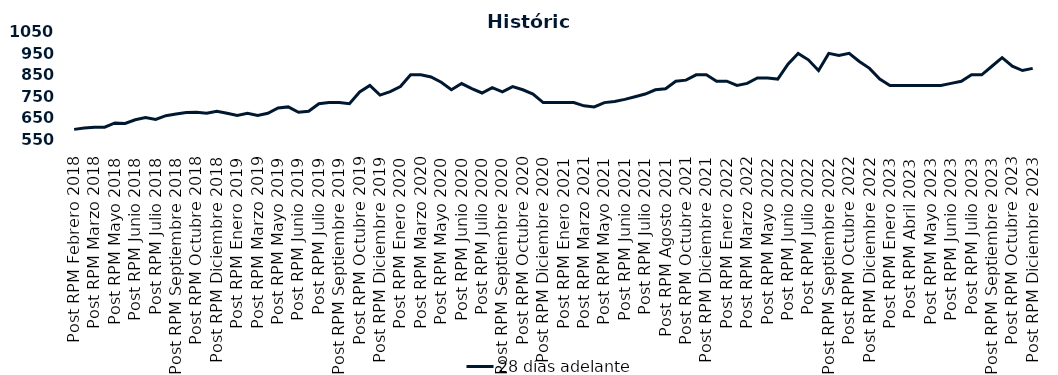
| Category | 28 días adelante |
|---|---|
| Post RPM Febrero 2018 | 595 |
| Pre RPM Marzo 2018 | 601 |
| Post RPM Marzo 2018 | 605 |
| Pre RPM Mayo 2018 | 605 |
| Post RPM Mayo 2018 | 625 |
| Pre RPM Junio 2018 | 623 |
| Post RPM Junio 2018 | 640 |
| Pre RPM Julio 2018 | 650 |
| Post RPM Julio 2018 | 641 |
| Pre RPM Septiembre 2018 | 659 |
| Post RPM Septiembre 2018 | 666.75 |
| Pre RPM Octubre 2018 | 674 |
| Post RPM Octubre 2018 | 675 |
| Pre RPM Diciembre 2018 | 670 |
| Post RPM Diciembre 2018 | 680 |
| Pre RPM Enero 2019 | 670 |
| Post RPM Enero 2019 | 660 |
| Pre RPM Marzo 2019 | 670 |
| Post RPM Marzo 2019 | 660 |
| Pre RPM Mayo 2019 | 670 |
| Post RPM Mayo 2019 | 695 |
| Pre RPM Junio 2019 | 700 |
| Post RPM Junio 2019 | 675 |
| Pre RPM Julio 2019 | 680 |
| Post RPM Julio 2019 | 715 |
| Pre RPM Septiembre 2019 | 720 |
| Post RPM Septiembre 2019 | 720 |
| Pre RPM Octubre 2019 | 715 |
| Post RPM Octubre 2019 | 770 |
| Pre RPM Diciembre 2019 | 800 |
| Post RPM Diciembre 2019 | 755 |
| Pre RPM Enero 2020 | 771 |
| Post RPM Enero 2020 | 795 |
| Pre RPM Marzo 2020 | 850 |
| Post RPM Marzo 2020 | 850 |
| Pre RPM Mayo 2020 | 840 |
| Post RPM Mayo 2020 | 815 |
| Pre RPM Junio 2020 | 780 |
| Post RPM Junio 2020 | 809 |
| Pre RPM Julio 2020 | 785.72 |
| Post RPM Julio 2020 | 765 |
| Pre RPM Septiembre 2020 | 790 |
| Post RPM Septiembre 2020 | 770 |
| Pre RPM Octubre 2020 | 795 |
| Post RPM Octubre 2020 | 780 |
| Pre RPM Diciembre 2020 | 760 |
| Post RPM Diciembre 2020 | 720 |
| Pre RPM Enero 2021 | 720 |
| Post RPM Enero 2021 | 720 |
| Pre RPM Marzo 2021 | 720 |
| Post RPM Marzo 2021 | 705 |
| Pre RPM Mayo 2021 | 700 |
| Post RPM Mayo 2021 | 720 |
| Pre RPM Junio 2021 | 725 |
| Post RPM Junio 2021 | 735 |
| Pre RPM Julio 2021 | 747.5 |
| Post RPM Julio 2021 | 760 |
| Pre RPM Agosto 2021 | 780 |
| Post RPM Agosto 2021 | 785 |
| Pre RPM Octubre 2021 | 820 |
| Post RPM Octubre 2021 | 825 |
| Pre RPM Diciembre 2021 | 850 |
| Post RPM Diciembre 2021 | 850 |
| Pre RPM Enero 2022 | 820 |
| Post RPM Enero 2022 | 820 |
| Pre RPM Marzo 2022 | 800 |
| Post RPM Marzo 2022 | 810 |
| Pre RPM Mayo 2022 | 835 |
| Post RPM Mayo 2022 | 835 |
| Pre RPM Junio 2022 | 830 |
| Post RPM Junio 2022 | 900 |
| Pre RPM Julio 2022 | 950 |
| Post RPM Julio 2022 | 920 |
| Pre RPM Septiembre 2022 | 870 |
| Post RPM Septiembre 2022 | 950 |
| Pre RPM Octubre 2022 | 940 |
| Post RPM Octubre 2022 | 950 |
| Pre RPM Diciembre 2022 | 912.5 |
| Post RPM Diciembre 2022 | 880 |
| Pre RPM Enero 2023 | 830 |
| Post RPM Enero 2023 | 800 |
| Pre RPM Abril 2023 | 800 |
| Post RPM Abril 2023 | 800 |
| Pre RPM Mayo 2023 | 800 |
| Post RPM Mayo 2023 | 800 |
| Pre RPM Junio 2023 | 800 |
| Post RPM Junio 2023 | 810 |
| Pre RPM Julio 2023 | 820 |
| Post RPM Julio 2023 | 850 |
| Pre RPM Septiembre 2023 | 850 |
| Post RPM Septiembre 2023 | 890 |
| Pre RPM Octubre 2023 | 930 |
| Post RPM Octubre 2023 | 890 |
| Pre RPM Diciembre 2023 | 870 |
| Post RPM Diciembre 2023 | 880 |